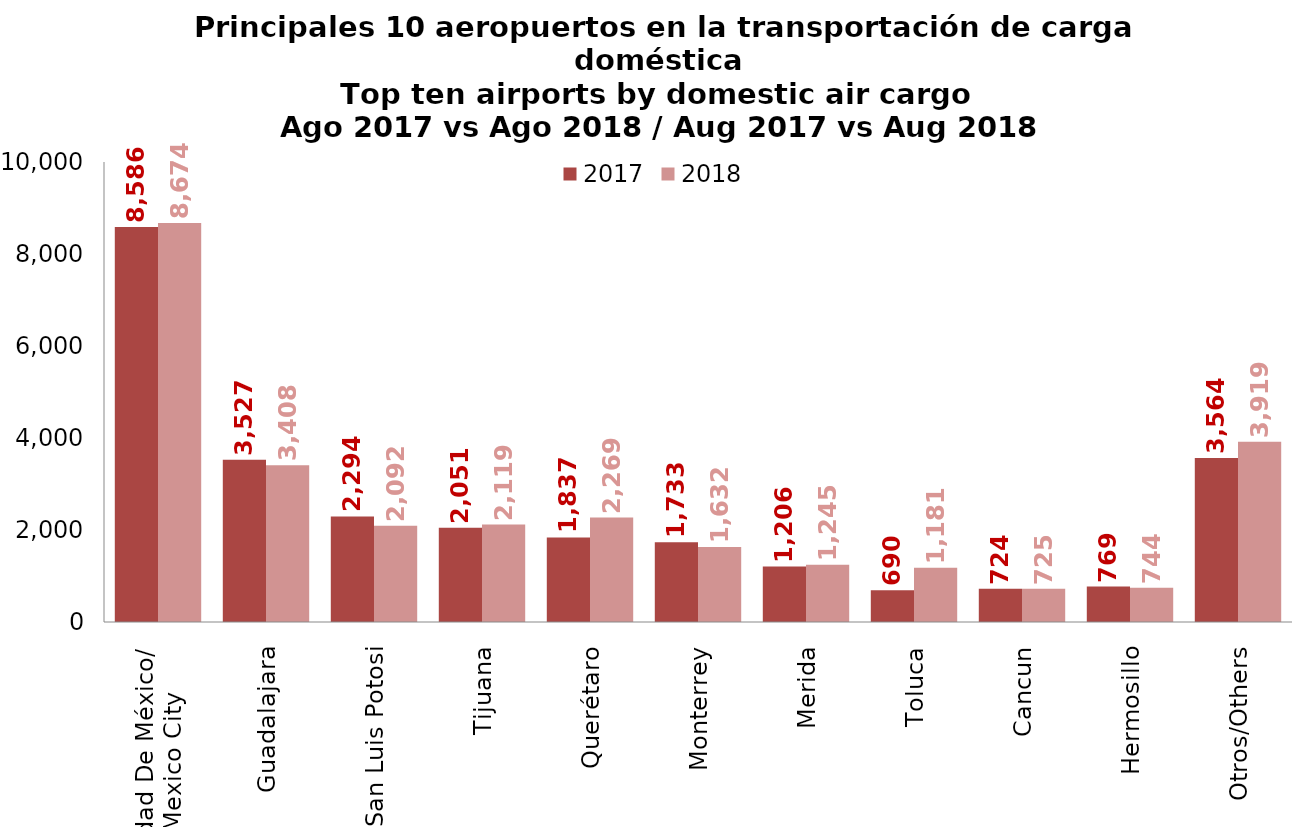
| Category | 2017 | 2018 |
|---|---|---|
| Ciudad De México/
Mexico City | 8585.53 | 8673.96 |
| Guadalajara | 3526.651 | 3407.6 |
| San Luis Potosi | 2294.332 | 2091.676 |
| Tijuana | 2050.914 | 2118.536 |
| Querétaro | 1837.273 | 2269.03 |
| Monterrey | 1732.745 | 1632.428 |
| Merida | 1205.718 | 1245.103 |
| Toluca | 690.476 | 1181.494 |
| Cancun | 723.669 | 724.523 |
| Hermosillo | 769.171 | 744.149 |
| Otros/Others | 3564.026 | 3918.666 |